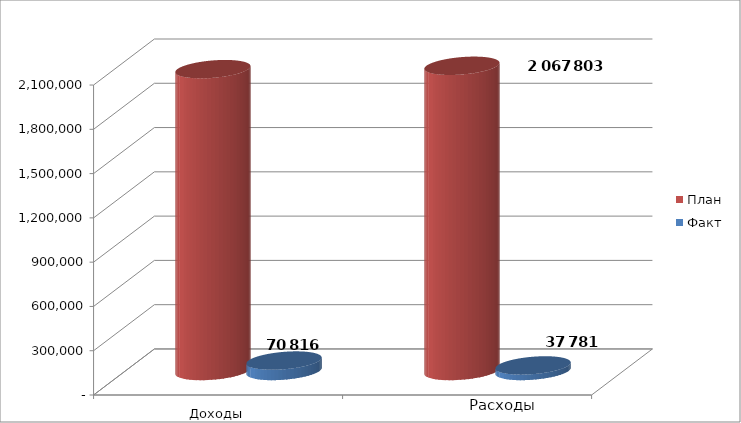
| Category | План | Факт |
|---|---|---|
| 0 | 2045130 | 70816 |
| 1 | 2067803 | 37781 |